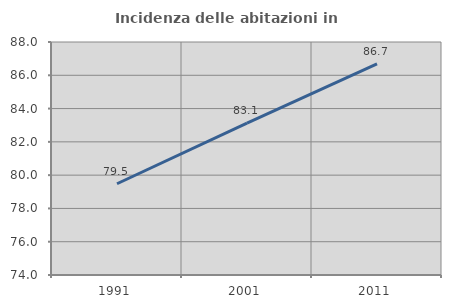
| Category | Incidenza delle abitazioni in proprietà  |
|---|---|
| 1991.0 | 79.482 |
| 2001.0 | 83.122 |
| 2011.0 | 86.684 |